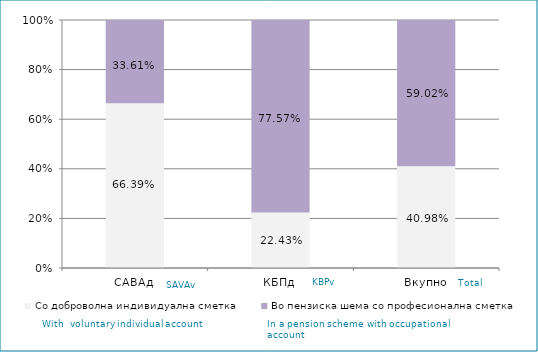
| Category | Со доброволна индивидуална сметка  | Во пензиска шема со професионална сметка |
|---|---|---|
| САВАд | 0.664 | 0.336 |
| КБПд | 0.224 | 0.776 |
| Вкупно | 0.41 | 0.59 |